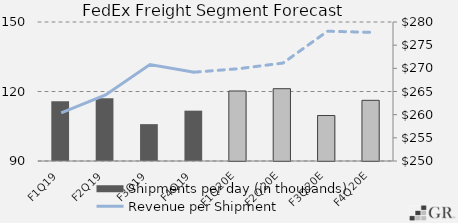
| Category | Shipments per day (in thousands) |
|---|---|
|  F1Q19  | 115.745 |
|  F2Q19  | 117.05 |
|  F3Q19  | 105.912 |
|  F4Q19  | 111.729 |
|  F1Q20E  | 120.22 |
|  F2Q20E  | 121.211 |
|  F3Q20E  | 109.627 |
|  F4Q20E  | 116.194 |